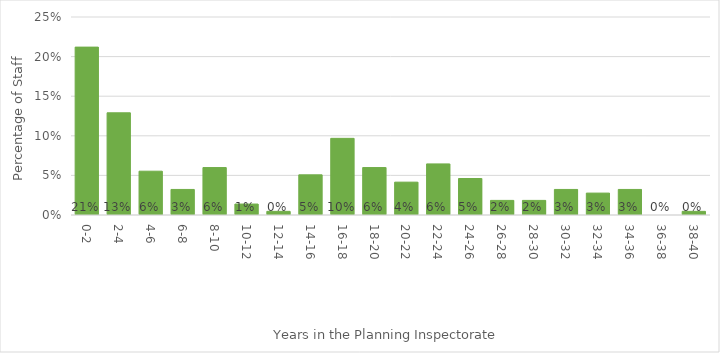
| Category | Percentage of Staff |
|---|---|
| 0-2 | 0.212 |
| 2-4 | 0.129 |
| 4-6 | 0.055 |
| 6-8 | 0.032 |
| 8-10 | 0.06 |
| 10-12 | 0.014 |
| 12-14 | 0.005 |
| 14-16 | 0.051 |
| 16-18 | 0.097 |
| 18-20 | 0.06 |
| 20-22 | 0.041 |
| 22-24 | 0.065 |
| 24-26 | 0.046 |
| 26-28 | 0.018 |
| 28-30 | 0.018 |
| 30-32 | 0.032 |
| 32-34 | 0.028 |
| 34-36 | 0.032 |
| 36-38 | 0 |
| 38-40 | 0.005 |